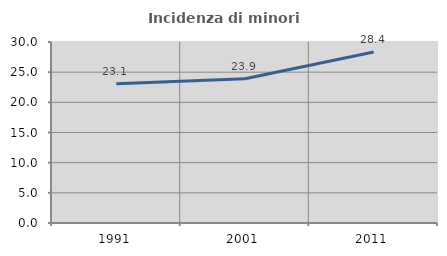
| Category | Incidenza di minori stranieri |
|---|---|
| 1991.0 | 23.077 |
| 2001.0 | 23.894 |
| 2011.0 | 28.355 |